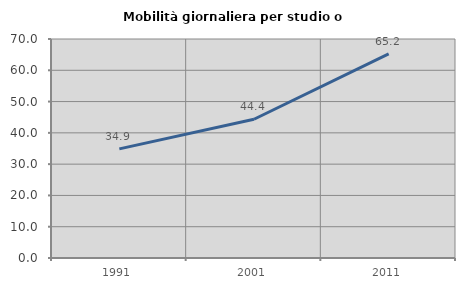
| Category | Mobilità giornaliera per studio o lavoro |
|---|---|
| 1991.0 | 34.888 |
| 2001.0 | 44.351 |
| 2011.0 | 65.227 |